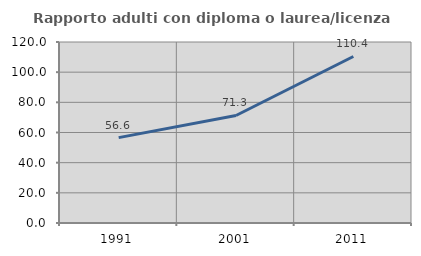
| Category | Rapporto adulti con diploma o laurea/licenza media  |
|---|---|
| 1991.0 | 56.597 |
| 2001.0 | 71.281 |
| 2011.0 | 110.399 |